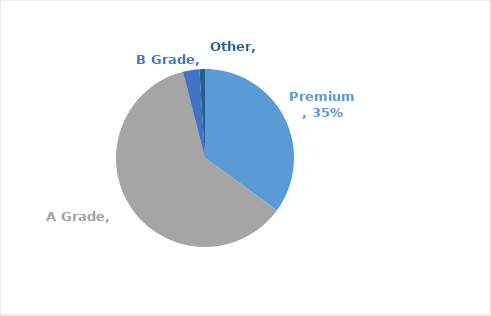
| Category | Series 0 |
|---|---|
| Premium | 0.35 |
| A Grade | 0.61 |
| B Grade | 0.03 |
| Other | 0.01 |